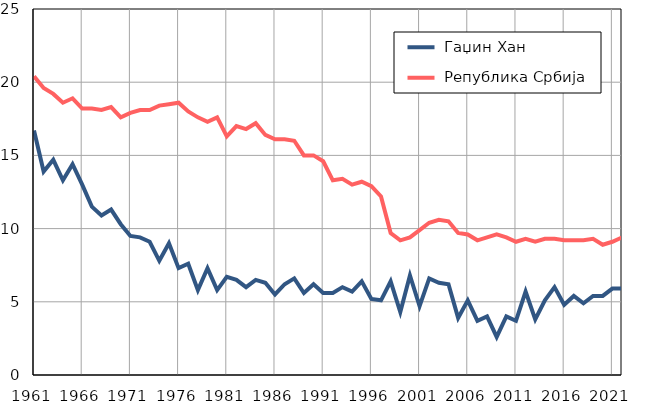
| Category |  Гаџин Хан |  Република Србија |
|---|---|---|
| 1961.0 | 16.7 | 20.4 |
| 1962.0 | 13.9 | 19.6 |
| 1963.0 | 14.7 | 19.2 |
| 1964.0 | 13.3 | 18.6 |
| 1965.0 | 14.4 | 18.9 |
| 1966.0 | 13 | 18.2 |
| 1967.0 | 11.5 | 18.2 |
| 1968.0 | 10.9 | 18.1 |
| 1969.0 | 11.3 | 18.3 |
| 1970.0 | 10.3 | 17.6 |
| 1971.0 | 9.5 | 17.9 |
| 1972.0 | 9.4 | 18.1 |
| 1973.0 | 9.1 | 18.1 |
| 1974.0 | 7.8 | 18.4 |
| 1975.0 | 9 | 18.5 |
| 1976.0 | 7.3 | 18.6 |
| 1977.0 | 7.6 | 18 |
| 1978.0 | 5.8 | 17.6 |
| 1979.0 | 7.3 | 17.3 |
| 1980.0 | 5.8 | 17.6 |
| 1981.0 | 6.7 | 16.3 |
| 1982.0 | 6.5 | 17 |
| 1983.0 | 6 | 16.8 |
| 1984.0 | 6.5 | 17.2 |
| 1985.0 | 6.3 | 16.4 |
| 1986.0 | 5.5 | 16.1 |
| 1987.0 | 6.2 | 16.1 |
| 1988.0 | 6.6 | 16 |
| 1989.0 | 5.6 | 15 |
| 1990.0 | 6.2 | 15 |
| 1991.0 | 5.6 | 14.6 |
| 1992.0 | 5.6 | 13.3 |
| 1993.0 | 6 | 13.4 |
| 1994.0 | 5.7 | 13 |
| 1995.0 | 6.4 | 13.2 |
| 1996.0 | 5.2 | 12.9 |
| 1997.0 | 5.1 | 12.2 |
| 1998.0 | 6.4 | 9.7 |
| 1999.0 | 4.3 | 9.2 |
| 2000.0 | 6.8 | 9.4 |
| 2001.0 | 4.7 | 9.9 |
| 2002.0 | 6.6 | 10.4 |
| 2003.0 | 6.3 | 10.6 |
| 2004.0 | 6.2 | 10.5 |
| 2005.0 | 3.9 | 9.7 |
| 2006.0 | 5.1 | 9.6 |
| 2007.0 | 3.7 | 9.2 |
| 2008.0 | 4 | 9.4 |
| 2009.0 | 2.6 | 9.6 |
| 2010.0 | 4 | 9.4 |
| 2011.0 | 3.7 | 9.1 |
| 2012.0 | 5.7 | 9.3 |
| 2013.0 | 3.8 | 9.1 |
| 2014.0 | 5.1 | 9.3 |
| 2015.0 | 6 | 9.3 |
| 2016.0 | 4.8 | 9.2 |
| 2017.0 | 5.4 | 9.2 |
| 2018.0 | 4.9 | 9.2 |
| 2019.0 | 5.4 | 9.3 |
| 2020.0 | 5.4 | 8.9 |
| 2021.0 | 5.9 | 9.1 |
| 2022.0 | 5.9 | 9.4 |